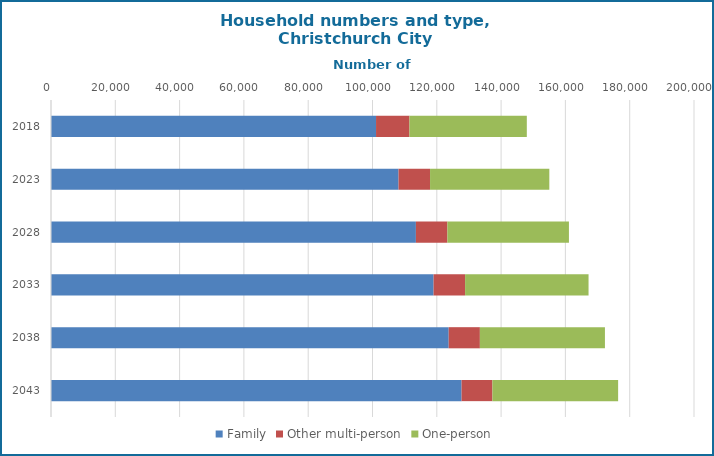
| Category | Family | Other multi-person | One-person |
|---|---|---|---|
| 2018.0 | 101100 | 10400 | 36500 |
| 2023.0 | 108100 | 9800 | 37100 |
| 2028.0 | 113500 | 9800 | 37800 |
| 2033.0 | 119000 | 9800 | 38400 |
| 2038.0 | 123700 | 9700 | 38900 |
| 2043.0 | 127700 | 9600 | 39100 |